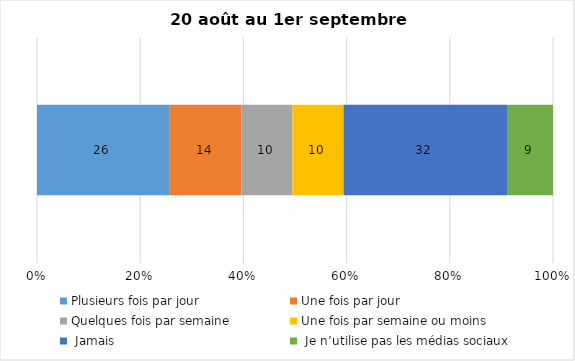
| Category | Plusieurs fois par jour | Une fois par jour | Quelques fois par semaine   | Une fois par semaine ou moins   |  Jamais   |  Je n’utilise pas les médias sociaux |
|---|---|---|---|---|---|---|
| 0 | 26 | 14 | 10 | 10 | 32 | 9 |